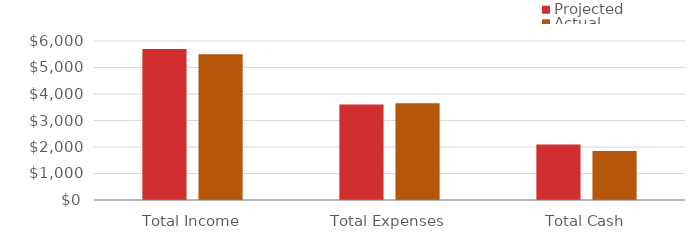
| Category | Projected | Actual |
|---|---|---|
| Total Income | 5700 | 5500 |
| Total Expenses | 3603 | 3655 |
| Total Cash | 2097 | 1845 |